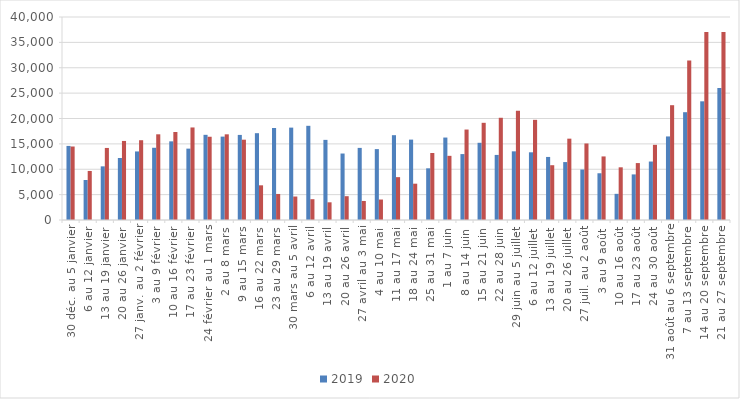
| Category | 2019 | 2020 |
|---|---|---|
| 30 déc. au 5 janvier | 14597 | 14482 |
| 6 au 12 janvier | 7879 | 9663 |
| 13 au 19 janvier | 10570 | 14197 |
| 20 au 26 janvier | 12222 | 15577 |
| 27 janv. au 2 février | 13510 | 15721 |
| 3 au 9 février | 14232 | 16885 |
| 10 au 16 février | 15499 | 17345 |
| 17 au 23 février | 14063 | 18234 |
| 24 février au 1 mars | 16783 | 16404 |
| 2 au 8 mars | 16432 | 16882.5 |
| 9 au 15 mars | 16765 | 15824.5 |
| 16 au 22 mars | 17107 | 6834 |
| 23 au 29 mars | 18126 | 5131 |
| 30 mars au 5 avril | 18204 | 4626 |
| 6 au 12 avril | 18560 | 4100 |
| 13 au 19 avril | 15788 | 3487 |
| 20 au 26 avril | 13099 | 4691 |
| 27 avril au 3 mai | 14207 | 3751 |
| 4 au 10 mai | 13969 | 4034 |
| 11 au 17 mai | 16713 | 8443 |
| 18 au 24 mai | 15841 | 7155 |
| 25 au 31 mai | 10184 | 13199 |
| 1 au 7 juin | 16246 | 12643 |
| 8 au 14 juin | 12988 | 17824 |
| 15 au 21 juin | 15214 | 19150 |
| 22 au 28 juin | 12823 | 20143 |
| 29 juin au 5 juillet | 13531 | 21526 |
| 6 au 12 juillet | 13339 | 19737 |
| 13 au 19 juillet | 12424 | 10796 |
| 20 au 26 juillet | 11414 | 16027 |
| 27 juil. au 2 août | 9944 | 15078 |
| 3 au 9 août | 9210 | 12526 |
| 10 au 16 août | 5155 | 10382 |
| 17 au 23 août | 8985 | 11217 |
| 24 au 30 août | 11520 | 14812 |
| 31 août au 6 septembre | 16465 | 22621 |
| 7 au 13 septembre | 21242 | 31419 |
| 14 au 20 septembre | 23386 | 37058 |
| 21 au 27 septembre | 26016 | 37043 |